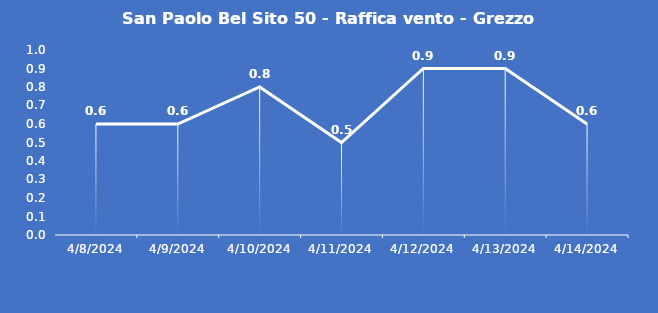
| Category | San Paolo Bel Sito 50 - Raffica vento - Grezzo (m/s) |
|---|---|
| 4/8/24 | 0.6 |
| 4/9/24 | 0.6 |
| 4/10/24 | 0.8 |
| 4/11/24 | 0.5 |
| 4/12/24 | 0.9 |
| 4/13/24 | 0.9 |
| 4/14/24 | 0.6 |